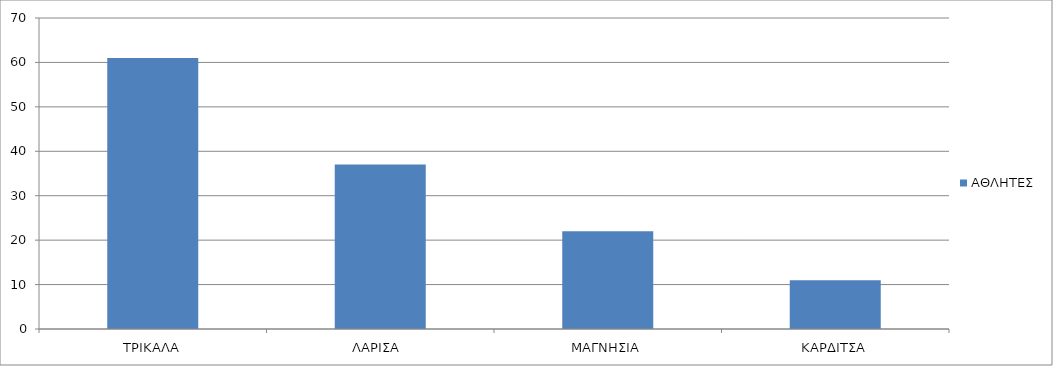
| Category | ΑΘΛΗΤΕΣ |
|---|---|
| ΤΡΙΚΑΛΑ | 61 |
| ΛΑΡΙΣΑ  | 37 |
| ΜΑΓΝΗΣΙΑ | 22 |
| ΚΑΡΔΙΤΣΑ | 11 |